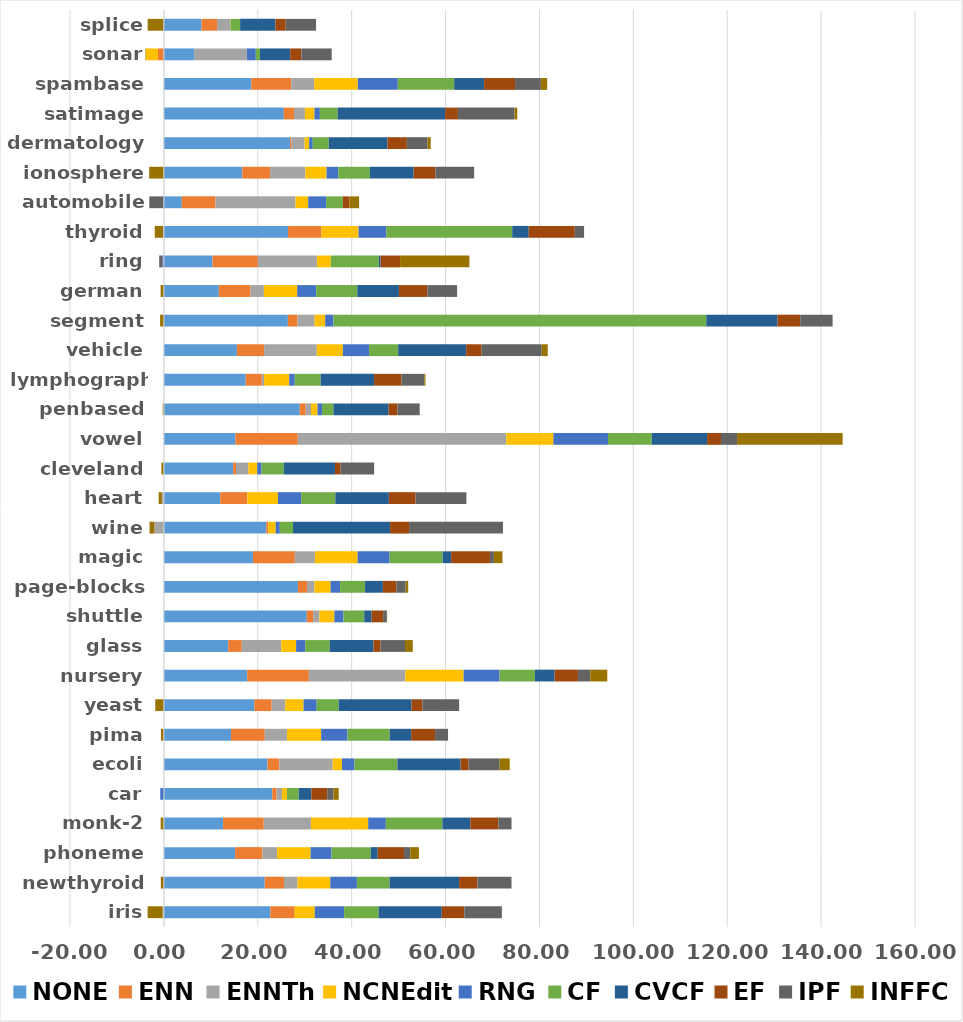
| Category | NONE | ENN | ENNTh | NCNEdit | RNG | CF | CVCF | EF | IPF | INFFC |
|---|---|---|---|---|---|---|---|---|---|---|
| iris | 22.667 | 5.2 | -0.267 | 4.267 | 6.267 | 7.333 | 13.467 | 4.8 | 8 | -3.2 |
| newthyroid | 21.488 | 4.093 | 2.884 | 6.977 | 5.674 | 6.977 | 14.791 | 3.907 | 7.256 | -0.651 |
| phoneme | 15.166 | 5.833 | 3.098 | 7.15 | 4.482 | 8.335 | 1.488 | 5.607 | 1.336 | 1.843 |
| monk-2 | 12.612 | 8.666 | 10.049 | 12.196 | 3.759 | 12.048 | 5.943 | 5.984 | 2.79 | -0.686 |
| car | 23.079 | 0.914 | 1.169 | 1.053 | -0.775 | 2.511 | 2.685 | 3.38 | 1.331 | 1.111 |
| ecoli | 22.081 | 2.504 | 11.37 | 1.97 | 2.687 | 9.127 | 13.453 | 1.725 | 6.606 | 2.141 |
| pima | 14.299 | 7.191 | 4.745 | 7.266 | 5.624 | 8.961 | 4.582 | 5.103 | 2.763 | -0.626 |
| yeast | 19.27 | 3.692 | 2.898 | 3.895 | 2.79 | 4.69 | 15.524 | 2.291 | 7.843 | -1.834 |
| nursery | 17.746 | 13.132 | 20.553 | 12.422 | 7.655 | 7.53 | 4.181 | 4.984 | 2.623 | 3.627 |
| glass | 13.714 | 2.877 | 8.399 | 3.174 | 1.942 | 5.214 | 9.324 | 1.499 | 5.212 | 1.666 |
| shuttle | 30.437 | 1.352 | 1.352 | 3.182 | 1.931 | 4.423 | 1.582 | 2.446 | 0.791 | 0.064 |
| page-blocks | 28.556 | 1.923 | 1.59 | 3.439 | 2.029 | 5.318 | 3.794 | 2.891 | 1.963 | 0.541 |
| magic | 18.977 | 8.916 | 4.288 | 9.085 | 6.821 | 11.29 | 1.812 | 8.264 | 0.842 | 1.828 |
| wine | 21.813 | 0.438 | -2.013 | 1.562 | 0.883 | 2.813 | 20.676 | 4.048 | 20 | -1.035 |
| heart | 12 | 5.778 | -0.444 | 6.519 | 4.963 | 7.259 | 11.407 | 5.704 | 10.815 | -0.667 |
| cleveland | 14.754 | 0.608 | 2.626 | 1.884 | 0.946 | 4.713 | 10.914 | 1.209 | 7.131 | -0.536 |
| vowel | 15.232 | 13.293 | 44.404 | 10.04 | 11.636 | 9.313 | 11.798 | 2.949 | 3.434 | 22.485 |
| penbased | 28.936 | 1.279 | 1.121 | 1.388 | 0.964 | 2.413 | 11.77 | 1.883 | 4.732 | -0.251 |
| lymphography | 17.43 | 3.43 | 0.487 | 5.347 | 1.182 | 5.517 | 11.375 | 5.839 | 4.86 | 0.262 |
| vehicle | 15.557 | 5.792 | 11.225 | 5.558 | 5.577 | 6.193 | 14.493 | 3.287 | 12.791 | 1.298 |
| segment | 26.416 | 2.052 | 3.636 | 2.26 | 1.758 | 79.42 | 15.16 | 4.84 | 6.909 | -0.805 |
| german | 11.7 | 6.76 | 2.84 | 7.1 | 4.06 | 8.74 | 8.86 | 6.06 | 6.34 | -0.7 |
| ring | 10.368 | 9.654 | 12.584 | 2.951 | -0.335 | 10.232 | 0.368 | 4.157 | -0.668 | 14.765 |
| thyroid | 26.442 | 7.136 | -0.178 | 7.881 | 5.903 | 26.839 | 3.511 | 9.822 | 1.972 | -1.772 |
| automobile | 3.81 | 7.206 | 17.024 | 2.706 | 3.819 | 3.569 | -0.117 | 1.403 | -2.996 | 2.052 |
| ionosphere | 16.698 | 5.921 | 7.52 | 4.503 | 2.502 | 6.724 | 9.342 | 4.621 | 8.267 | -3.138 |
| dermatology | 26.861 | 0.281 | 2.843 | 0.946 | 0.782 | 3.404 | 12.514 | 4.128 | 4.413 | 0.67 |
| satimage | 25.532 | 2.182 | 2.325 | 2.036 | 1.15 | 3.789 | 22.894 | 2.729 | 12.056 | 0.587 |
| spambase | 18.616 | 8.523 | 4.877 | 9.297 | 8.514 | 12.003 | 6.378 | 6.6 | 5.495 | 1.344 |
| sonar | 6.441 | -1.266 | 11.238 | -2.606 | 1.902 | 0.878 | 6.441 | 2.4 | 6.441 | -0.1 |
| splice | 8.023 | 3.304 | 2.801 | 0.054 | -0.066 | 2.056 | 7.523 | 2.198 | 6.459 | -3.391 |